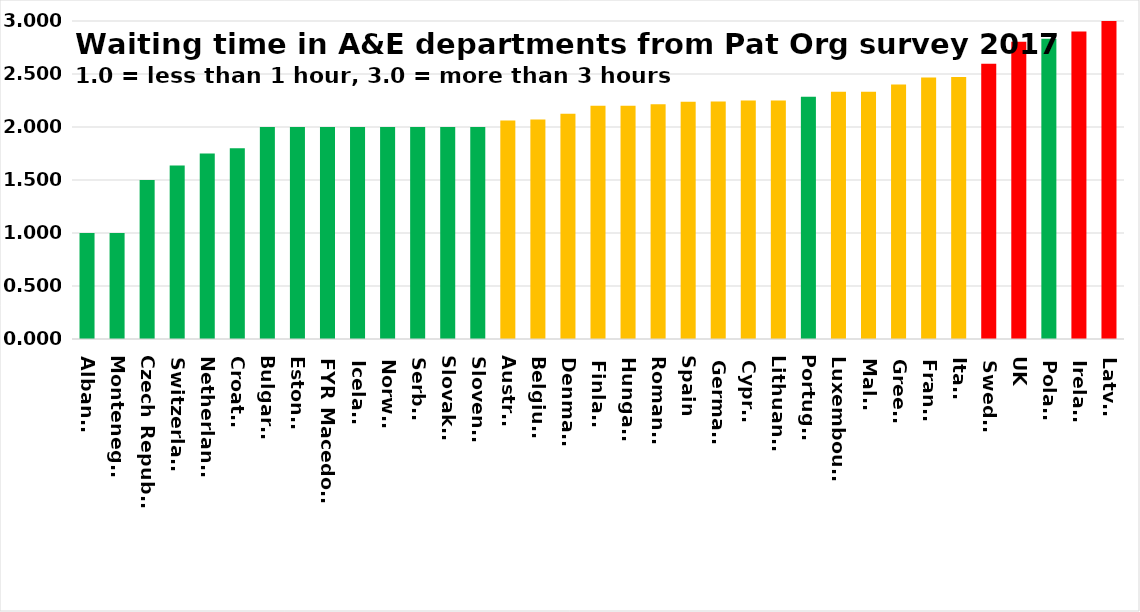
| Category | Series 0 |
|---|---|
| Albania | 1 |
| Montenegro | 1 |
| Czech Republic | 1.5 |
| Switzerland | 1.636 |
| Netherlands | 1.75 |
| Croatia | 1.8 |
| Bulgaria | 2 |
| Estonia | 2 |
| FYR Macedonia | 2 |
| Iceland | 2 |
| Norway | 2 |
| Serbia | 2 |
| Slovakia | 2 |
| Slovenia | 2 |
| Austria | 2.062 |
| Belgium | 2.071 |
| Denmark | 2.125 |
| Finland | 2.2 |
| Hungary | 2.2 |
| Romania | 2.214 |
| Spain | 2.238 |
| Germany | 2.241 |
| Cyprus | 2.25 |
| Lithuania | 2.25 |
| Portugal | 2.286 |
| Luxembourg | 2.333 |
| Malta | 2.333 |
| Greece | 2.4 |
| France | 2.467 |
| Italy | 2.471 |
| Sweden | 2.596 |
| UK | 2.805 |
| Poland | 2.833 |
| Ireland | 2.9 |
| Latvia | 3 |